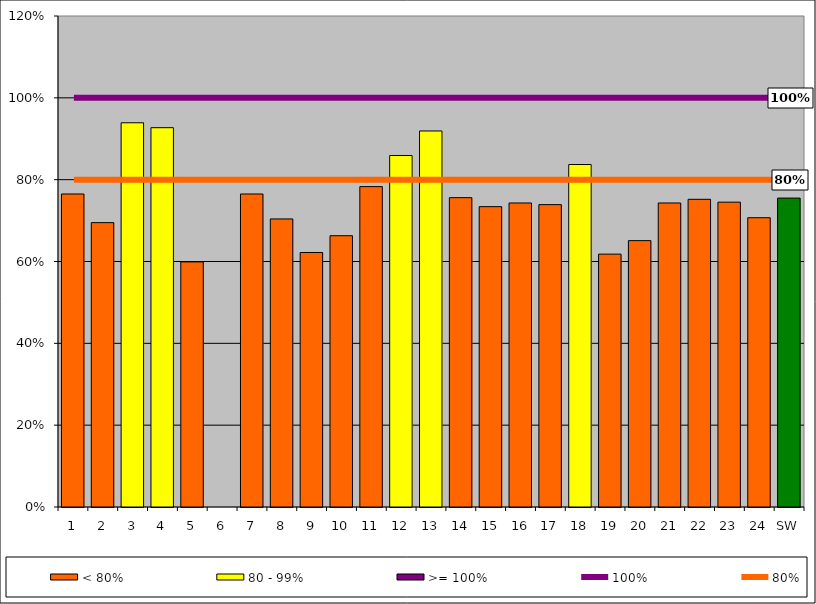
| Category | < 80% | 80 - 99% | >= 100% |
|---|---|---|---|
| 1 | 0.765 | 0 | 0 |
| 2 | 0.695 | 0 | 0 |
| 3 | 0 | 0.939 | 0 |
| 4 | 0 | 0.927 | 0 |
| 5 | 0.599 | 0 | 0 |
| 6 | 0 | 0 | 0 |
| 7 | 0.765 | 0 | 0 |
| 8 | 0.704 | 0 | 0 |
| 9 | 0.622 | 0 | 0 |
| 10 | 0.663 | 0 | 0 |
| 11 | 0.783 | 0 | 0 |
| 12 | 0 | 0.859 | 0 |
| 13 | 0 | 0.919 | 0 |
| 14 | 0.756 | 0 | 0 |
| 15 | 0.734 | 0 | 0 |
| 16 | 0.743 | 0 | 0 |
| 17 | 0.739 | 0 | 0 |
| 18 | 0 | 0.837 | 0 |
| 19 | 0.618 | 0 | 0 |
| 20 | 0.651 | 0 | 0 |
| 21 | 0.743 | 0 | 0 |
| 22 | 0.752 | 0 | 0 |
| 23 | 0.745 | 0 | 0 |
| 24 | 0.707 | 0 | 0 |
| SW | 0.755 | 0 | 0 |